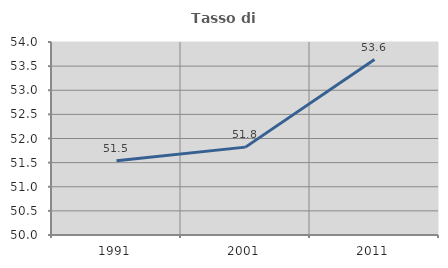
| Category | Tasso di occupazione   |
|---|---|
| 1991.0 | 51.537 |
| 2001.0 | 51.821 |
| 2011.0 | 53.635 |